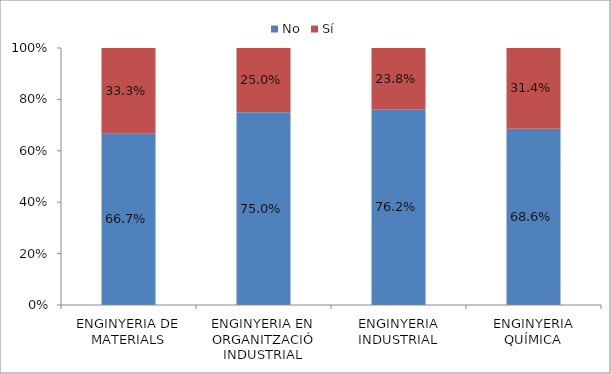
| Category | No | Sí |
|---|---|---|
| ENGINYERIA DE MATERIALS | 0.667 | 0.333 |
| ENGINYERIA EN ORGANITZACIÓ INDUSTRIAL | 0.75 | 0.25 |
| ENGINYERIA INDUSTRIAL | 0.762 | 0.238 |
| ENGINYERIA QUÍMICA | 0.686 | 0.314 |